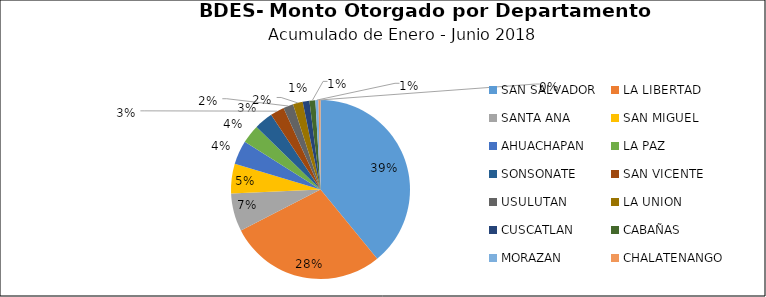
| Category | Monto | Créditos |
|---|---|---|
| SAN SALVADOR | 34.238 | 799 |
| LA LIBERTAD | 24.836 | 235 |
| SANTA ANA | 6.005 | 424 |
| SAN MIGUEL | 4.678 | 338 |
| AHUACHAPAN | 3.777 | 98 |
| LA PAZ | 2.959 | 330 |
| SONSONATE | 2.954 | 111 |
| SAN VICENTE | 2.212 | 137 |
| USULUTAN | 1.59 | 187 |
| LA UNION | 1.544 | 173 |
| CUSCATLAN | 1.064 | 48 |
| CABAÑAS | 0.931 | 16 |
| MORAZAN | 0.481 | 38 |
| CHALATENANGO | 0.322 | 22 |